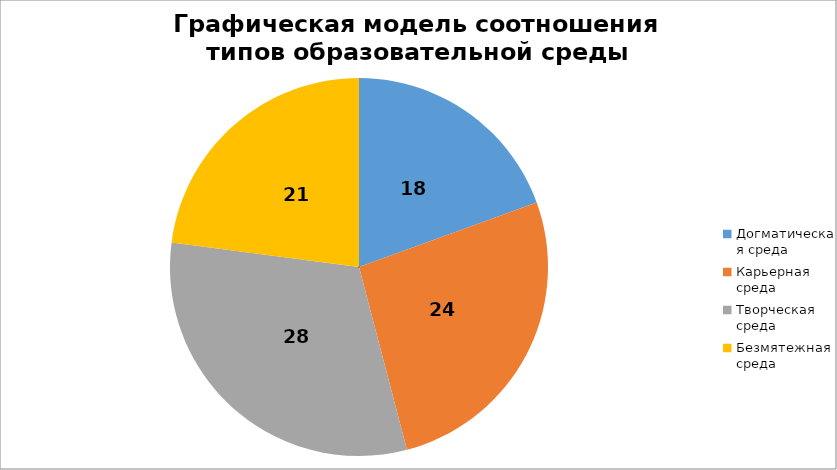
| Category | Графическая модель соотношения типов образовательной среды |
|---|---|
| Догматическая среда | 17.55 |
| Карьерная среда | 23.85 |
| Творческая среда | 28.09 |
| Безмятежная среда | 20.67 |